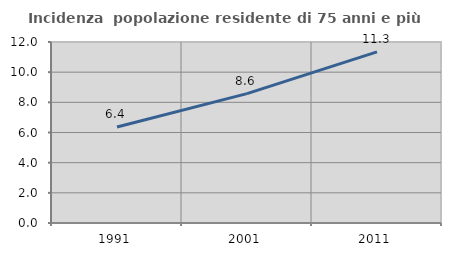
| Category | Incidenza  popolazione residente di 75 anni e più |
|---|---|
| 1991.0 | 6.363 |
| 2001.0 | 8.576 |
| 2011.0 | 11.343 |